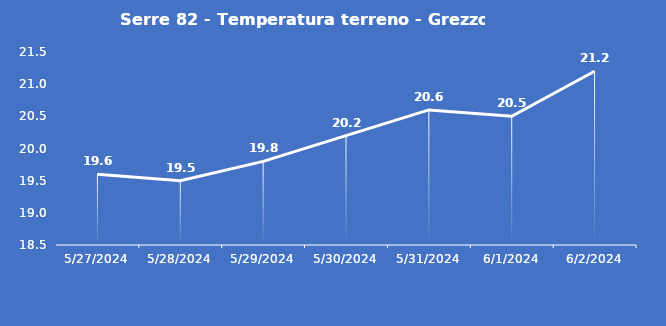
| Category | Serre 82 - Temperatura terreno - Grezzo (°C) |
|---|---|
| 5/27/24 | 19.6 |
| 5/28/24 | 19.5 |
| 5/29/24 | 19.8 |
| 5/30/24 | 20.2 |
| 5/31/24 | 20.6 |
| 6/1/24 | 20.5 |
| 6/2/24 | 21.2 |